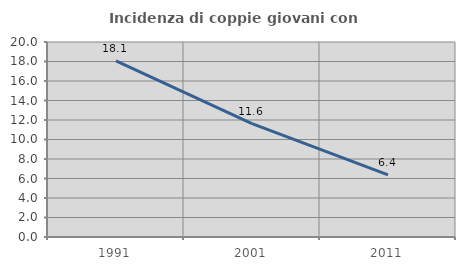
| Category | Incidenza di coppie giovani con figli |
|---|---|
| 1991.0 | 18.074 |
| 2001.0 | 11.626 |
| 2011.0 | 6.379 |